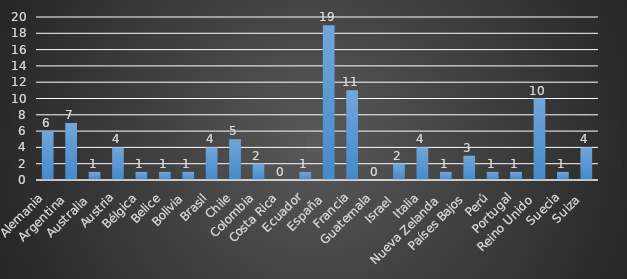
| Category | Series 0 |
|---|---|
| Alemania | 6 |
| Argentina  | 7 |
| Australia  | 1 |
| Austria | 4 |
| Bélgica | 1 |
| Belice | 1 |
| Bolivia | 1 |
| Brasil | 4 |
| Chile | 5 |
| Colombia | 2 |
| Costa Rica | 0 |
| Ecuador | 1 |
| España  | 19 |
| Francia | 11 |
| Guatemala | 0 |
| Israel  | 2 |
| Italia | 4 |
| Nueva Zelanda  | 1 |
| Países Bajos | 3 |
| Perú | 1 |
| Portugal | 1 |
| Reino Unido  | 10 |
| Suecia | 1 |
| Suiza  | 4 |